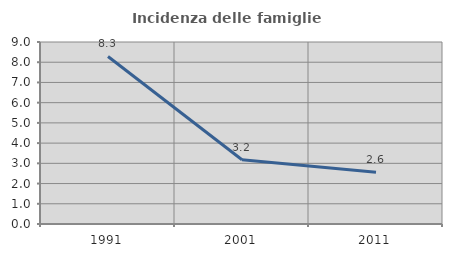
| Category | Incidenza delle famiglie numerose |
|---|---|
| 1991.0 | 8.285 |
| 2001.0 | 3.18 |
| 2011.0 | 2.555 |